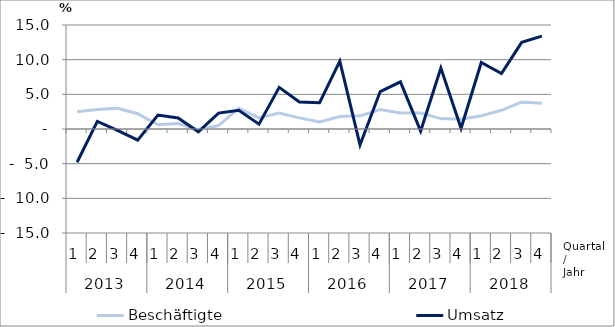
| Category | Beschäftigte | Umsatz |
|---|---|---|
| 0 | 2.5 | -4.8 |
| 1 | 2.8 | 1.1 |
| 2 | 3 | -0.2 |
| 3 | 2.2 | -1.6 |
| 4 | 0.6 | 2 |
| 5 | 0.8 | 1.6 |
| 6 | -0.1 | -0.4 |
| 7 | 0.5 | 2.3 |
| 8 | 3 | 2.7 |
| 9 | 1.6 | 0.7 |
| 10 | 2.3 | 6 |
| 11 | 1.6 | 3.9 |
| 12 | 1 | 3.8 |
| 13 | 1.8 | 9.8 |
| 14 | 1.9 | -2.3 |
| 15 | 2.8 | 5.4 |
| 16 | 2.3 | 6.8 |
| 17 | 2.3 | -0.3 |
| 18 | 1.5 | 8.8 |
| 19 | 1.4 | 0.1 |
| 20 | 1.9 | 9.6 |
| 21 | 2.7 | 8 |
| 22 | 3.9 | 12.5 |
| 23 | 3.7 | 13.4 |